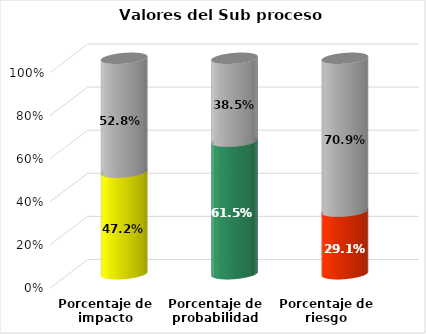
| Category | Series 0 | Series 1 |
|---|---|---|
| Porcentaje de impacto | 0.472 | 0.528 |
| Porcentaje de probabilidad | 0.615 | 0.385 |
| Porcentaje de riesgo | 0.291 | 0.709 |